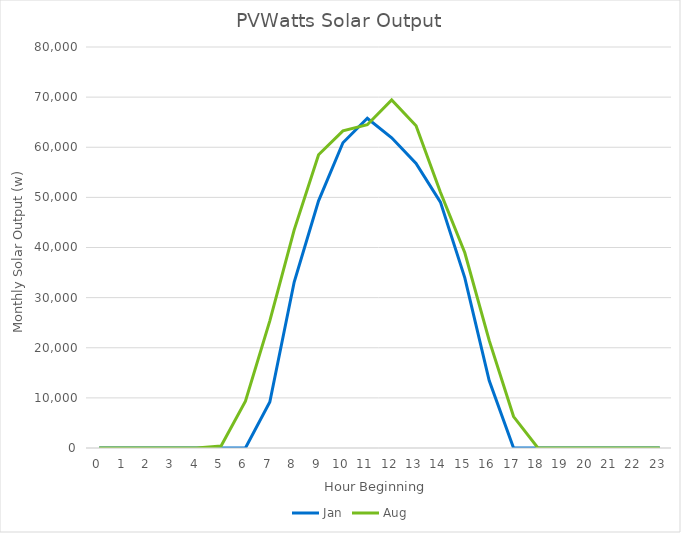
| Category | Jan | Aug |
|---|---|---|
| 0.0 | 0 | 0 |
| 1.0 | 0 | 0 |
| 2.0 | 0 | 0 |
| 3.0 | 0 | 0 |
| 4.0 | 0 | 0 |
| 5.0 | 0 | 390.086 |
| 6.0 | 0 | 9338.367 |
| 7.0 | 9176.532 | 25369.758 |
| 8.0 | 33109.97 | 43516.043 |
| 9.0 | 49306.517 | 58495.971 |
| 10.0 | 60895.471 | 63259.68 |
| 11.0 | 65793.072 | 64488.383 |
| 12.0 | 61894.155 | 69427.379 |
| 13.0 | 56785.784 | 64291.604 |
| 14.0 | 49047.562 | 51025.578 |
| 15.0 | 33946.388 | 38942.451 |
| 16.0 | 13439.724 | 21464.465 |
| 17.0 | 0 | 6270.045 |
| 18.0 | 0 | 12.02 |
| 19.0 | 0 | 0 |
| 20.0 | 0 | 0 |
| 21.0 | 0 | 0 |
| 22.0 | 0 | 0 |
| 23.0 | 0 | 0 |